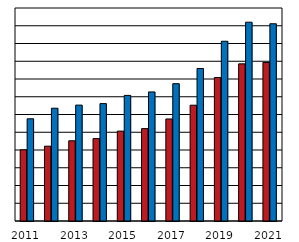
| Category | ženy  Women | muži  
Men |
|---|---|---|
| 2011.0 | 10010.973 | 11758.548 |
| 2012.0 | 10215.288 | 12353.53 |
| 2013.0 | 10519.157 | 12528.285 |
| 2014.0 | 10643.295 | 12612.75 |
| 2015.0 | 11064 | 13076 |
| 2016.0 | 11205 | 13272 |
| 2017.0 | 11748 | 13737 |
| 2018.0 | 12523 | 14590 |
| 2019.0 | 14081 | 16126 |
| 2020.0 | 14853 | 17199 |
| 2021.0 | 14931 | 17111 |